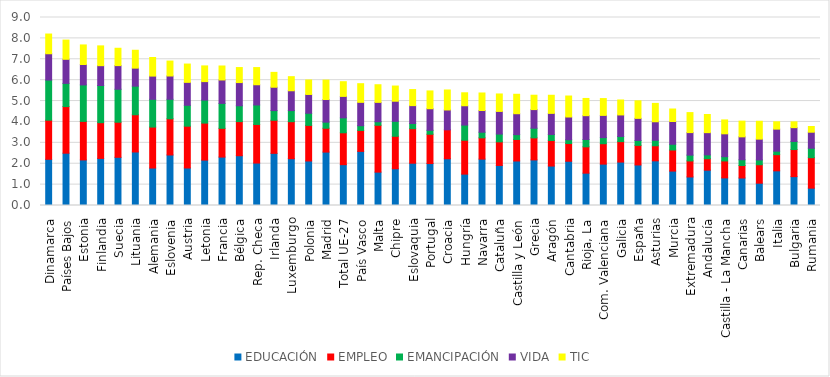
| Category | EDUCACIÓN | EMPLEO | EMANCIPACIÓN | VIDA | TIC |
|---|---|---|---|---|---|
| Dinamarca | 2.213 | 1.871 | 1.921 | 1.26 | 0.944 |
| Países Bajos | 2.504 | 2.232 | 1.111 | 1.152 | 0.92 |
| Estonia | 2.182 | 1.845 | 1.747 | 0.977 | 0.937 |
| Finlandia | 2.255 | 1.71 | 1.78 | 0.949 | 0.948 |
| Suecia | 2.307 | 1.68 | 1.579 | 1.131 | 0.83 |
| Lituania | 2.562 | 1.781 | 1.37 | 0.863 | 0.856 |
| Alemania | 1.793 | 1.961 | 1.329 | 1.112 | 0.89 |
| Eslovenia | 2.419 | 1.732 | 0.934 | 1.115 | 0.714 |
| Austria | 1.796 | 2.002 | 1 | 1.097 | 0.877 |
| Letonia | 2.173 | 1.772 | 1.101 | 0.885 | 0.752 |
| Francia | 2.318 | 1.376 | 1.194 | 1.122 | 0.669 |
| Bélgica | 2.383 | 1.632 | 0.759 | 1.11 | 0.719 |
| Rep. Checa | 2.032 | 1.848 | 0.933 | 0.968 | 0.823 |
| Irlanda | 2.496 | 1.583 | 0.464 | 1.117 | 0.712 |
| Luxemburgo | 2.239 | 1.772 | 0.533 | 0.949 | 0.675 |
| Polonia | 2.131 | 1.704 | 0.58 | 0.9 | 0.694 |
| Madrid | 2.557 | 1.142 | 0.292 | 1.084 | 0.93 |
| Total UE-27 | 1.955 | 1.526 | 0.716 | 1.026 | 0.704 |
| País Vasco | 2.591 | 1.001 | 0.227 | 1.119 | 0.893 |
| Malta | 1.598 | 2.242 | 0.168 | 0.928 | 0.844 |
| Chipre | 1.759 | 1.555 | 0.717 | 0.961 | 0.727 |
| Eslovaquia | 2.025 | 1.653 | 0.249 | 0.855 | 0.769 |
| Portugal | 2.008 | 1.404 | 0.187 | 1.033 | 0.853 |
| Croacia | 2.239 | 1.383 | -0.061 | 0.952 | 0.957 |
| Hungría | 1.502 | 1.622 | 0.727 | 0.924 | 0.621 |
| Navarra | 2.221 | 1.018 | 0.27 | 1.038 | 0.84 |
| Cataluña | 1.918 | 1.129 | 0.375 | 1.082 | 0.836 |
| Castilla y León | 2.13 | 1.031 | 0.231 | 1.001 | 0.931 |
| Grecia | 2.182 | 1.056 | 0.462 | 0.891 | 0.688 |
| Aragón | 1.888 | 1.224 | 0.289 | 1.009 | 0.867 |
| Cantabria | 2.119 | 0.848 | 0.181 | 1.089 | 1.005 |
| Rioja, La | 1.548 | 1.261 | 0.352 | 1.139 | 0.824 |
| Com. Valenciana | 1.981 | 0.977 | 0.292 | 1.063 | 0.806 |
| Galicia | 2.08 | 0.979 | 0.247 | 1.03 | 0.717 |
| España | 1.941 | 0.938 | 0.236 | 1.057 | 0.841 |
| Asturias | 2.138 | 0.721 | 0.264 | 0.885 | 0.88 |
| Murcia | 1.648 | 1.009 | 0.275 | 1.089 | 0.598 |
| Extremadura | 1.366 | 0.768 | 0.278 | 1.078 | 0.957 |
| Andalucía | 1.692 | 0.549 | 0.183 | 1.065 | 0.87 |
| Castilla - La Mancha | 1.322 | 0.811 | 0.205 | 1.094 | 0.665 |
| Canarias | 1.317 | 0.598 | 0.275 | 1.097 | 0.752 |
| Balears | 1.067 | 0.884 | 0.23 | 0.996 | 0.855 |
| Italia | 1.659 | 0.775 | 0.167 | 1.055 | 0.352 |
| Bulgaria | 1.382 | 1.297 | 0.388 | 0.66 | 0.278 |
| Rumania | 0.83 | 1.459 | 0.453 | 0.766 | 0.274 |